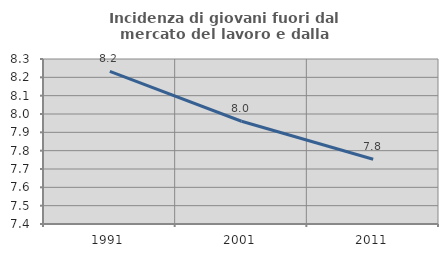
| Category | Incidenza di giovani fuori dal mercato del lavoro e dalla formazione  |
|---|---|
| 1991.0 | 8.232 |
| 2001.0 | 7.96 |
| 2011.0 | 7.753 |